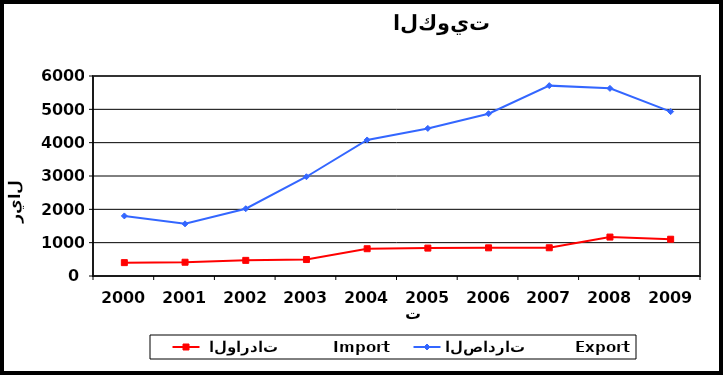
| Category |  الواردات           Import | الصادرات          Export |
|---|---|---|
| 2000.0 | 401 | 1802 |
| 2001.0 | 413 | 1565 |
| 2002.0 | 469 | 2018 |
| 2003.0 | 494 | 2978 |
| 2004.0 | 818 | 4081 |
| 2005.0 | 837 | 4428 |
| 2006.0 | 845 | 4869 |
| 2007.0 | 847 | 5711 |
| 2008.0 | 1168 | 5629 |
| 2009.0 | 1103 | 4932 |